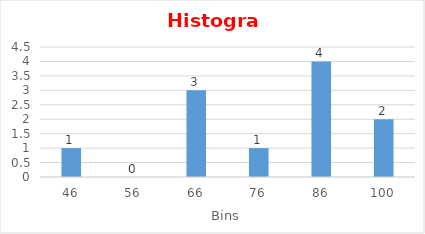
| Category | Series 0 |
|---|---|
| 46.0 | 1 |
| 56.0 | 0 |
| 66.0 | 3 |
| 76.0 | 1 |
| 86.0 | 4 |
| 100.0 | 2 |